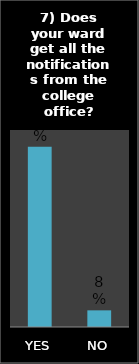
| Category | Series 0 |
|---|---|
| YES | 0.915 |
| NO | 0.085 |